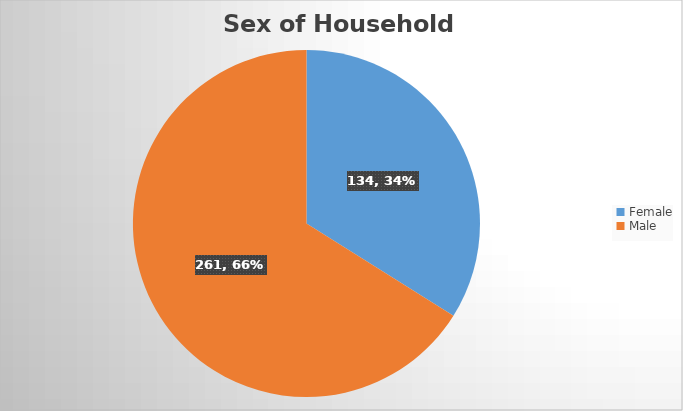
| Category | Sex of HouseholdHead |
|---|---|
| Female | 134 |
| Male | 261 |